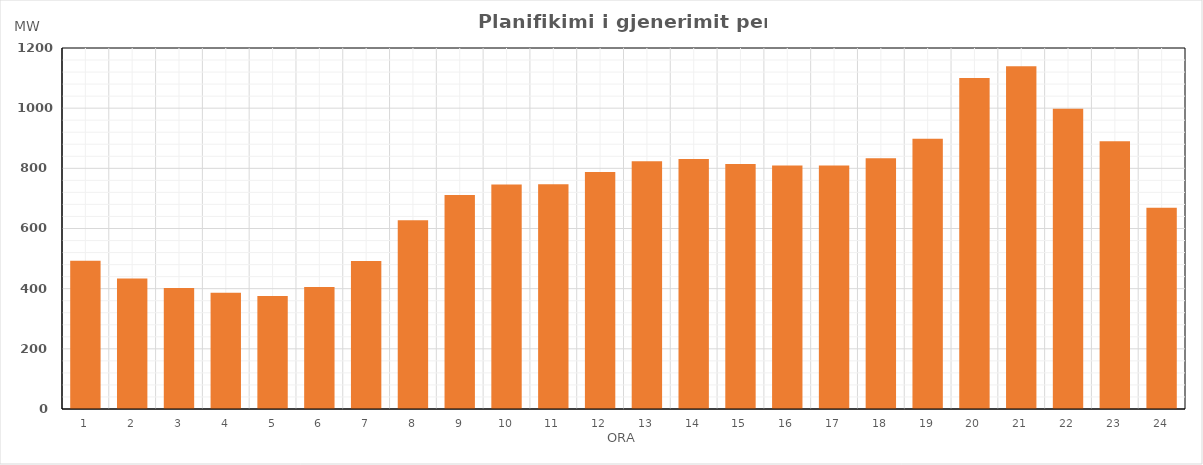
| Category | Max (MW) |
|---|---|
| 0 | 492.57 |
| 1 | 433.53 |
| 2 | 402.22 |
| 3 | 386.24 |
| 4 | 375.21 |
| 5 | 405.13 |
| 6 | 492.2 |
| 7 | 627.28 |
| 8 | 711.59 |
| 9 | 746.02 |
| 10 | 747.29 |
| 11 | 787.61 |
| 12 | 823.35 |
| 13 | 831.27 |
| 14 | 814.03 |
| 15 | 809.75 |
| 16 | 809.26 |
| 17 | 833.7 |
| 18 | 897.93 |
| 19 | 1100.22 |
| 20 | 1139.38 |
| 21 | 997.97 |
| 22 | 890.1 |
| 23 | 668.69 |